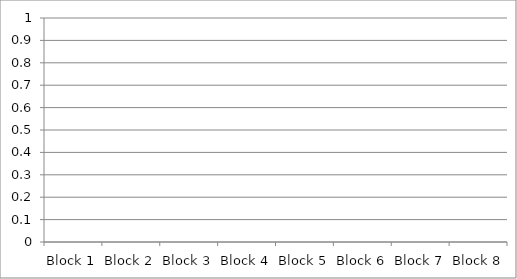
| Category | Series 0 |
|---|---|
| Block 1 | 0 |
| Block 2 | 0 |
| Block 3 | 0 |
| Block 4 | 0 |
| Block 5 | 0 |
| Block 6 | 0 |
| Block 7 | 0 |
| Block 8 | 0 |